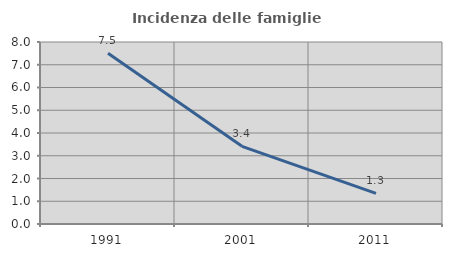
| Category | Incidenza delle famiglie numerose |
|---|---|
| 1991.0 | 7.503 |
| 2001.0 | 3.413 |
| 2011.0 | 1.346 |